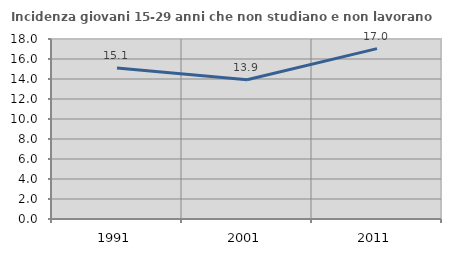
| Category | Incidenza giovani 15-29 anni che non studiano e non lavorano  |
|---|---|
| 1991.0 | 15.105 |
| 2001.0 | 13.921 |
| 2011.0 | 17.039 |